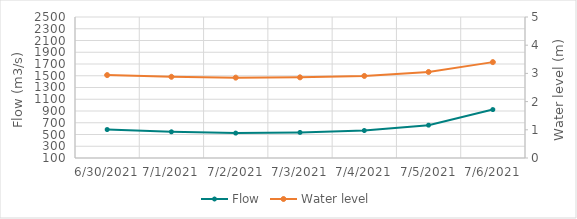
| Category | Flow |
|---|---|
| 5/25/21 | 783.29 |
| 5/24/21 | 826.64 |
| 5/23/21 | 1106.29 |
| 5/22/21 | 1298.82 |
| 5/21/21 | 1465.3 |
| 5/20/21 | 1708.64 |
| 5/19/21 | 2041.13 |